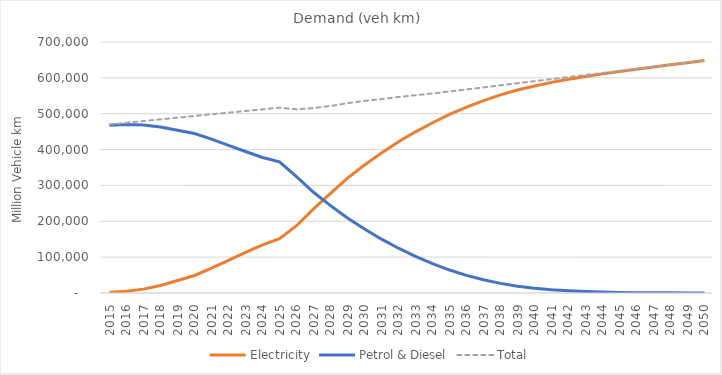
| Category | Electricity | Petrol & Diesel | Total |
|---|---|---|---|
| 2015.0 | 1949.802 | 468102.23 | 470052.032 |
| 2016.0 | 4878.003 | 469898.909 | 474776.911 |
| 2017.0 | 10795.152 | 468718.189 | 479513.342 |
| 2018.0 | 21115.97 | 463121.508 | 484237.478 |
| 2019.0 | 34879.858 | 454080.348 | 488960.206 |
| 2020.0 | 48813.77 | 444867.039 | 493680.809 |
| 2021.0 | 69303.15 | 429016.48 | 498319.63 |
| 2022.0 | 91114.86 | 411851.04 | 502965.9 |
| 2023.0 | 113034.637 | 394573.972 | 507608.609 |
| 2024.0 | 134346.94 | 377891.346 | 512238.286 |
| 2025.0 | 151276.07 | 365597.42 | 516873.49 |
| 2026.0 | 187707.49 | 324642.64 | 512350.13 |
| 2027.0 | 234726.54 | 281007.02 | 515733.56 |
| 2028.0 | 277904.84 | 243612.27 | 521517.11 |
| 2029.0 | 320197.5 | 209307 | 529504.5 |
| 2030.0 | 357131.3 | 178569.2 | 535700.5 |
| 2031.0 | 390792.18 | 150072.71 | 540864.89 |
| 2032.0 | 421683.19 | 124895.64 | 546578.83 |
| 2033.0 | 449528.51 | 102092.02 | 551620.53 |
| 2034.0 | 474778.44 | 81725.41 | 556503.85 |
| 2035.0 | 497955.99 | 64044.63 | 562000.62 |
| 2036.0 | 518587.45 | 49170.25 | 567757.7 |
| 2037.0 | 536601.42 | 36797.95 | 573399.37 |
| 2038.0 | 552509.83 | 26839.29 | 579349.12 |
| 2039.0 | 565934.27 | 19107.77 | 585042.04 |
| 2040.0 | 577396.97 | 13280.19 | 590677.16 |
| 2041.0 | 587478.325 | 8995.77 | 596474.095 |
| 2042.0 | 596194.131 | 5983.379 | 602177.51 |
| 2043.0 | 603948.957 | 3921.182 | 607870.139 |
| 2044.0 | 611125.066 | 2538.22 | 613663.286 |
| 2045.0 | 617735.781 | 1629.263 | 619365.044 |
| 2046.0 | 624127.099 | 1040.254 | 625167.354 |
| 2047.0 | 630392.3 | 660.874 | 631053.174 |
| 2048.0 | 636428.746 | 419.016 | 636847.762 |
| 2049.0 | 642394.289 | 265.487 | 642659.777 |
| 2050.0 | 648359.181 | 167.799 | 648526.98 |